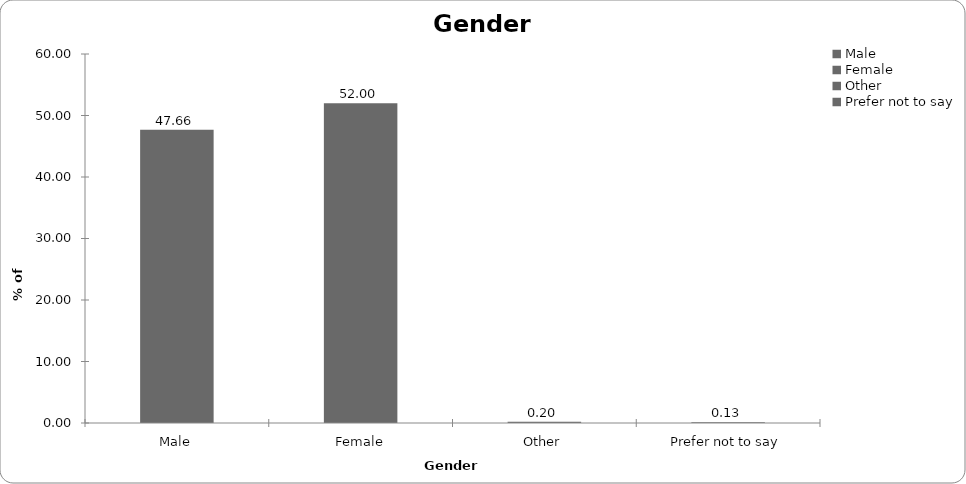
| Category | Series 0 |
|---|---|
| Male | 47.664 |
| Female | 52.003 |
| Other | 0.2 |
| Prefer not to say | 0.134 |